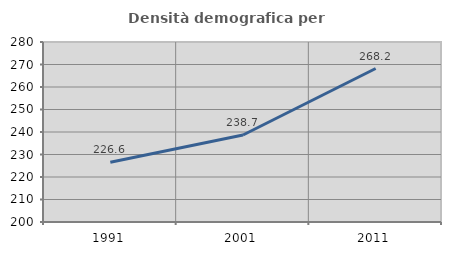
| Category | Densità demografica |
|---|---|
| 1991.0 | 226.596 |
| 2001.0 | 238.682 |
| 2011.0 | 268.215 |